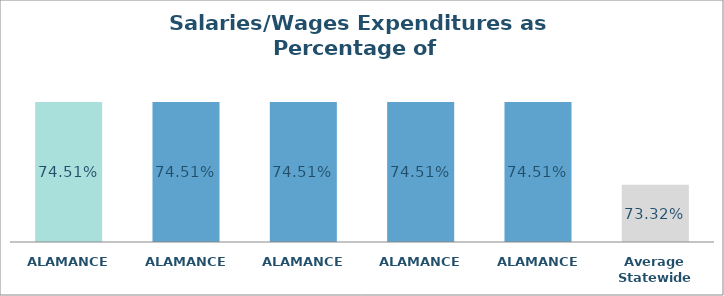
| Category | Series 0 |
|---|---|
| ALAMANCE  | 0.745 |
| ALAMANCE  | 0.745 |
| ALAMANCE  | 0.745 |
| ALAMANCE  | 0.745 |
| ALAMANCE  | 0.745 |
| Average Statewide | 0.733 |